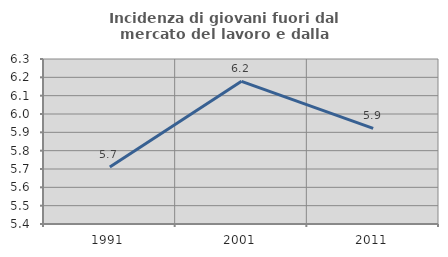
| Category | Incidenza di giovani fuori dal mercato del lavoro e dalla formazione  |
|---|---|
| 1991.0 | 5.712 |
| 2001.0 | 6.178 |
| 2011.0 | 5.922 |